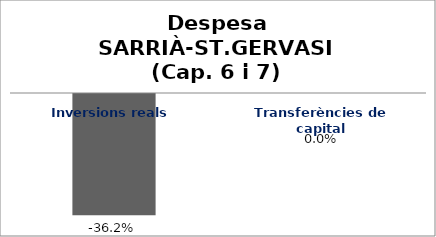
| Category | Series 0 |
|---|---|
| Inversions reals | -0.362 |
| Transferències de capital | 0 |